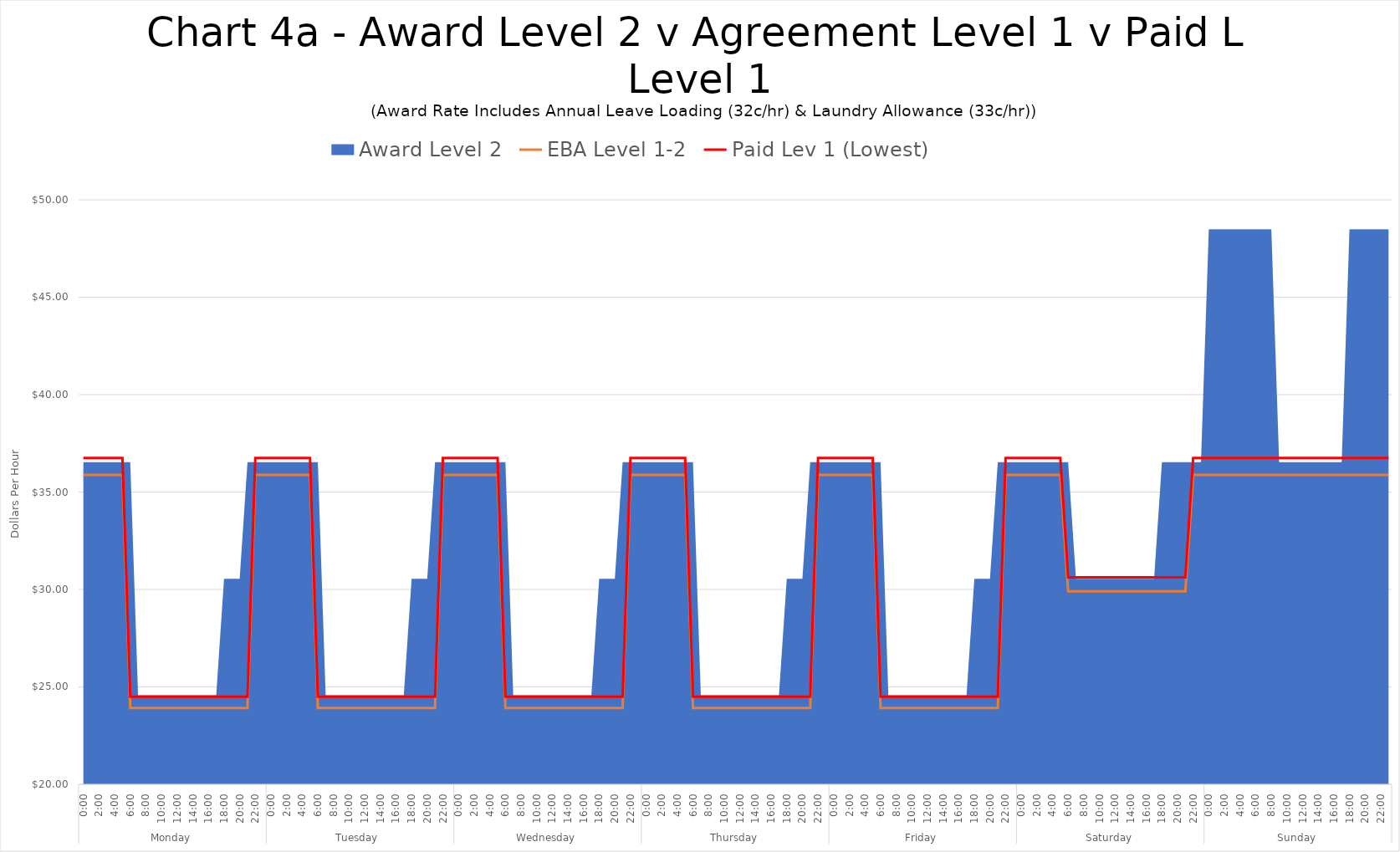
| Category | EBA Level 1-2 | Paid Lev 1 (Lowest) |
|---|---|---|
| 0 | 35.88 | 36.75 |
| 1 | 35.88 | 36.75 |
| 2 | 35.88 | 36.75 |
| 3 | 35.88 | 36.75 |
| 4 | 35.88 | 36.75 |
| 5 | 35.88 | 36.75 |
| 6 | 23.92 | 24.5 |
| 7 | 23.92 | 24.5 |
| 8 | 23.92 | 24.5 |
| 9 | 23.92 | 24.5 |
| 10 | 23.92 | 24.5 |
| 11 | 23.92 | 24.5 |
| 12 | 23.92 | 24.5 |
| 13 | 23.92 | 24.5 |
| 14 | 23.92 | 24.5 |
| 15 | 23.92 | 24.5 |
| 16 | 23.92 | 24.5 |
| 17 | 23.92 | 24.5 |
| 18 | 23.92 | 24.5 |
| 19 | 23.92 | 24.5 |
| 20 | 23.92 | 24.5 |
| 21 | 23.92 | 24.5 |
| 22 | 35.88 | 36.75 |
| 23 | 35.88 | 36.75 |
| 24 | 35.88 | 36.75 |
| 25 | 35.88 | 36.75 |
| 26 | 35.88 | 36.75 |
| 27 | 35.88 | 36.75 |
| 28 | 35.88 | 36.75 |
| 29 | 35.88 | 36.75 |
| 30 | 23.92 | 24.5 |
| 31 | 23.92 | 24.5 |
| 32 | 23.92 | 24.5 |
| 33 | 23.92 | 24.5 |
| 34 | 23.92 | 24.5 |
| 35 | 23.92 | 24.5 |
| 36 | 23.92 | 24.5 |
| 37 | 23.92 | 24.5 |
| 38 | 23.92 | 24.5 |
| 39 | 23.92 | 24.5 |
| 40 | 23.92 | 24.5 |
| 41 | 23.92 | 24.5 |
| 42 | 23.92 | 24.5 |
| 43 | 23.92 | 24.5 |
| 44 | 23.92 | 24.5 |
| 45 | 23.92 | 24.5 |
| 46 | 35.88 | 36.75 |
| 47 | 35.88 | 36.75 |
| 48 | 35.88 | 36.75 |
| 49 | 35.88 | 36.75 |
| 50 | 35.88 | 36.75 |
| 51 | 35.88 | 36.75 |
| 52 | 35.88 | 36.75 |
| 53 | 35.88 | 36.75 |
| 54 | 23.92 | 24.5 |
| 55 | 23.92 | 24.5 |
| 56 | 23.92 | 24.5 |
| 57 | 23.92 | 24.5 |
| 58 | 23.92 | 24.5 |
| 59 | 23.92 | 24.5 |
| 60 | 23.92 | 24.5 |
| 61 | 23.92 | 24.5 |
| 62 | 23.92 | 24.5 |
| 63 | 23.92 | 24.5 |
| 64 | 23.92 | 24.5 |
| 65 | 23.92 | 24.5 |
| 66 | 23.92 | 24.5 |
| 67 | 23.92 | 24.5 |
| 68 | 23.92 | 24.5 |
| 69 | 23.92 | 24.5 |
| 70 | 35.88 | 36.75 |
| 71 | 35.88 | 36.75 |
| 72 | 35.88 | 36.75 |
| 73 | 35.88 | 36.75 |
| 74 | 35.88 | 36.75 |
| 75 | 35.88 | 36.75 |
| 76 | 35.88 | 36.75 |
| 77 | 35.88 | 36.75 |
| 78 | 23.92 | 24.5 |
| 79 | 23.92 | 24.5 |
| 80 | 23.92 | 24.5 |
| 81 | 23.92 | 24.5 |
| 82 | 23.92 | 24.5 |
| 83 | 23.92 | 24.5 |
| 84 | 23.92 | 24.5 |
| 85 | 23.92 | 24.5 |
| 86 | 23.92 | 24.5 |
| 87 | 23.92 | 24.5 |
| 88 | 23.92 | 24.5 |
| 89 | 23.92 | 24.5 |
| 90 | 23.92 | 24.5 |
| 91 | 23.92 | 24.5 |
| 92 | 23.92 | 24.5 |
| 93 | 23.92 | 24.5 |
| 94 | 35.88 | 36.75 |
| 95 | 35.88 | 36.75 |
| 96 | 35.88 | 36.75 |
| 97 | 35.88 | 36.75 |
| 98 | 35.88 | 36.75 |
| 99 | 35.88 | 36.75 |
| 100 | 35.88 | 36.75 |
| 101 | 35.88 | 36.75 |
| 102 | 23.92 | 24.5 |
| 103 | 23.92 | 24.5 |
| 104 | 23.92 | 24.5 |
| 105 | 23.92 | 24.5 |
| 106 | 23.92 | 24.5 |
| 107 | 23.92 | 24.5 |
| 108 | 23.92 | 24.5 |
| 109 | 23.92 | 24.5 |
| 110 | 23.92 | 24.5 |
| 111 | 23.92 | 24.5 |
| 112 | 23.92 | 24.5 |
| 113 | 23.92 | 24.5 |
| 114 | 23.92 | 24.5 |
| 115 | 23.92 | 24.5 |
| 116 | 23.92 | 24.5 |
| 117 | 23.92 | 24.5 |
| 118 | 35.88 | 36.75 |
| 119 | 35.88 | 36.75 |
| 120 | 35.88 | 36.75 |
| 121 | 35.88 | 36.75 |
| 122 | 35.88 | 36.75 |
| 123 | 35.88 | 36.75 |
| 124 | 35.88 | 36.75 |
| 125 | 35.88 | 36.75 |
| 126 | 29.9 | 30.625 |
| 127 | 29.9 | 30.625 |
| 128 | 29.9 | 30.625 |
| 129 | 29.9 | 30.625 |
| 130 | 29.9 | 30.625 |
| 131 | 29.9 | 30.625 |
| 132 | 29.9 | 30.625 |
| 133 | 29.9 | 30.625 |
| 134 | 29.9 | 30.625 |
| 135 | 29.9 | 30.625 |
| 136 | 29.9 | 30.625 |
| 137 | 29.9 | 30.625 |
| 138 | 29.9 | 30.625 |
| 139 | 29.9 | 30.625 |
| 140 | 29.9 | 30.625 |
| 141 | 29.9 | 30.625 |
| 142 | 35.88 | 36.75 |
| 143 | 35.88 | 36.75 |
| 144 | 35.88 | 36.75 |
| 145 | 35.88 | 36.75 |
| 146 | 35.88 | 36.75 |
| 147 | 35.88 | 36.75 |
| 148 | 35.88 | 36.75 |
| 149 | 35.88 | 36.75 |
| 150 | 35.88 | 36.75 |
| 151 | 35.88 | 36.75 |
| 152 | 35.88 | 36.75 |
| 153 | 35.88 | 36.75 |
| 154 | 35.88 | 36.75 |
| 155 | 35.88 | 36.75 |
| 156 | 35.88 | 36.75 |
| 157 | 35.88 | 36.75 |
| 158 | 35.88 | 36.75 |
| 159 | 35.88 | 36.75 |
| 160 | 35.88 | 36.75 |
| 161 | 35.88 | 36.75 |
| 162 | 35.88 | 36.75 |
| 163 | 35.88 | 36.75 |
| 164 | 35.88 | 36.75 |
| 165 | 35.88 | 36.75 |
| 166 | 35.88 | 36.75 |
| 167 | 35.88 | 36.75 |